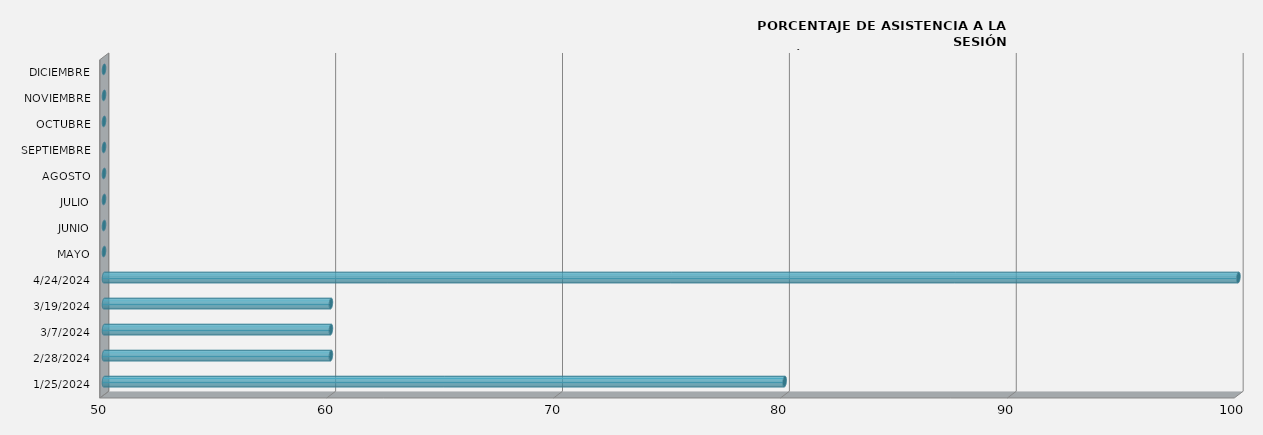
| Category | Series 0 |
|---|---|
| 25/01/2024 | 80 |
| 28/02/2024 | 60 |
| 07/03/2024 | 60 |
| 19/03/2024 | 60 |
| 24/04/2024 | 100 |
| MAYO | 0 |
| JUNIO | 0 |
| JULIO | 0 |
| AGOSTO | 0 |
| SEPTIEMBRE | 0 |
| OCTUBRE | 0 |
| NOVIEMBRE | 0 |
| DICIEMBRE | 0 |